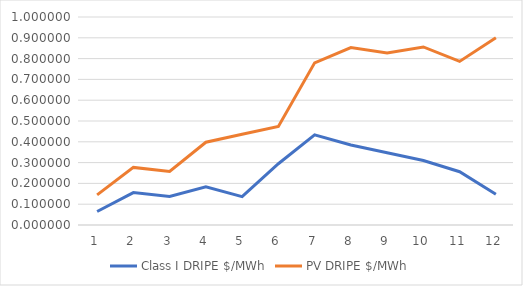
| Category | Class I DRIPE $/MWh | PV DRIPE $/MWh |
|---|---|---|
| 0 | 0.065 | 0.145 |
| 1 | 0.156 | 0.277 |
| 2 | 0.137 | 0.257 |
| 3 | 0.183 | 0.398 |
| 4 | 0.136 | 0.437 |
| 5 | 0.295 | 0.473 |
| 6 | 0.433 | 0.779 |
| 7 | 0.384 | 0.853 |
| 8 | 0.347 | 0.827 |
| 9 | 0.31 | 0.856 |
| 10 | 0.256 | 0.787 |
| 11 | 0.148 | 0.901 |